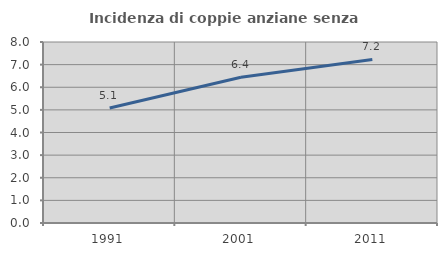
| Category | Incidenza di coppie anziane senza figli  |
|---|---|
| 1991.0 | 5.081 |
| 2001.0 | 6.443 |
| 2011.0 | 7.231 |